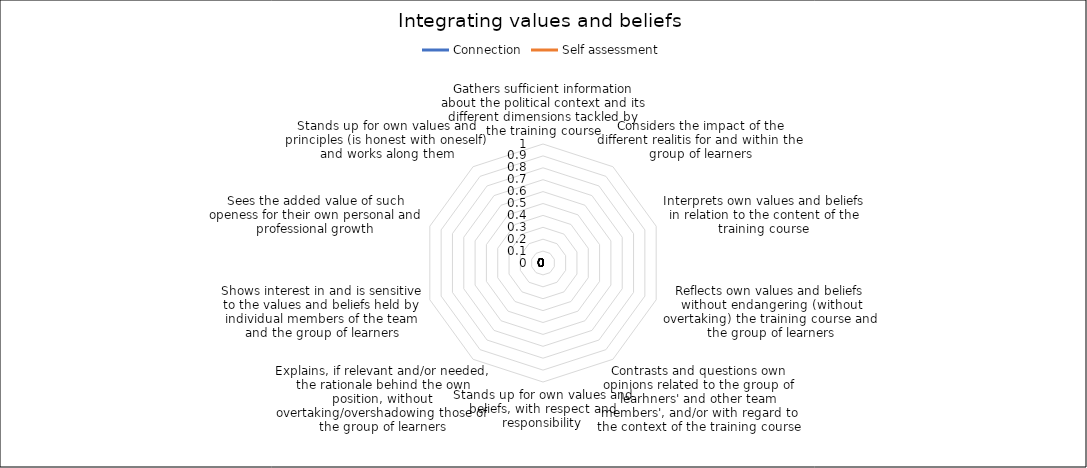
| Category | Connection | Self assessment |
|---|---|---|
| Gathers sufficient information about the political context and its different dimensions tackled by the training course | 0 | 0 |
| Considers the impact of the different realitis for and within the group of learners | 0 | 0 |
| Interprets own values and beliefs in relation to the content of the training course | 0 | 0 |
| Reflects own values and beliefs without endangering (without overtaking) the training course and the group of learners | 0 | 0 |
| Contrasts and questions own opinions related to the group of learhners' and other team members', and/or with regard to the context of the training course | 0 | 0 |
| Stands up for own values and beliefs, with respect and responsibility | 0 | 0 |
| Explains, if relevant and/or needed, the rationale behind the own position, without overtaking/overshadowing those of the group of learners | 0 | 0 |
| Shows interest in and is sensitive to the values and beliefs held by individual members of the team and the group of learners | 0 | 0 |
| Sees the added value of such openess for their own personal and professional growth | 0 | 0 |
| Stands up for own values and principles (is honest with oneself) and works along them | 0 | 0 |